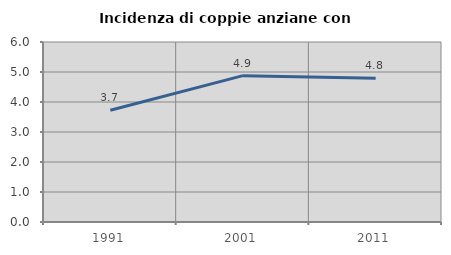
| Category | Incidenza di coppie anziane con figli |
|---|---|
| 1991.0 | 3.725 |
| 2001.0 | 4.878 |
| 2011.0 | 4.792 |